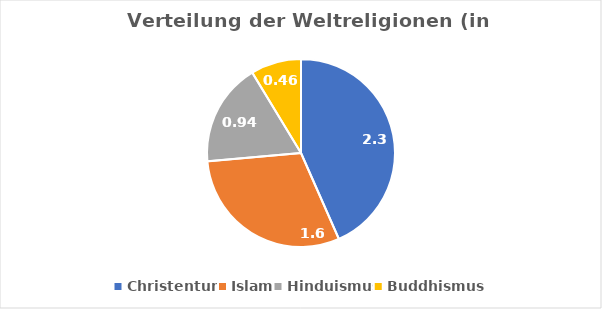
| Category | Anteil |
|---|---|
| Christentum | 2.3 |
| Islam | 1.6 |
| Hinduismus | 0.94 |
| Buddhismus | 0.46 |